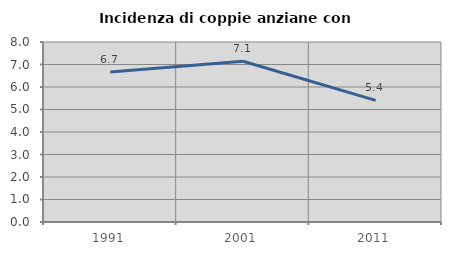
| Category | Incidenza di coppie anziane con figli |
|---|---|
| 1991.0 | 6.667 |
| 2001.0 | 7.143 |
| 2011.0 | 5.405 |